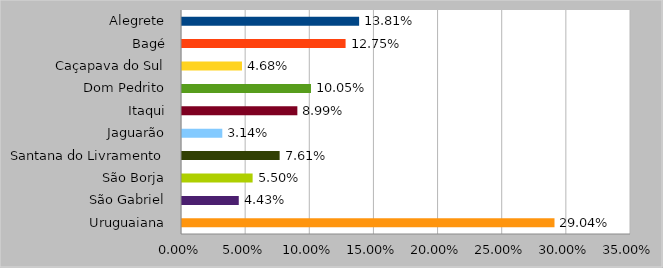
| Category | MATRIZ
(% de Alunos Equivalentes) |
|---|---|
| Alegrete | 0.138 |
| Bagé | 0.128 |
| Caçapava do Sul | 0.047 |
| Dom Pedrito | 0.101 |
| Itaqui | 0.09 |
| Jaguarão | 0.031 |
| Santana do Livramento | 0.076 |
| São Borja | 0.055 |
| São Gabriel | 0.044 |
| Uruguaiana | 0.29 |